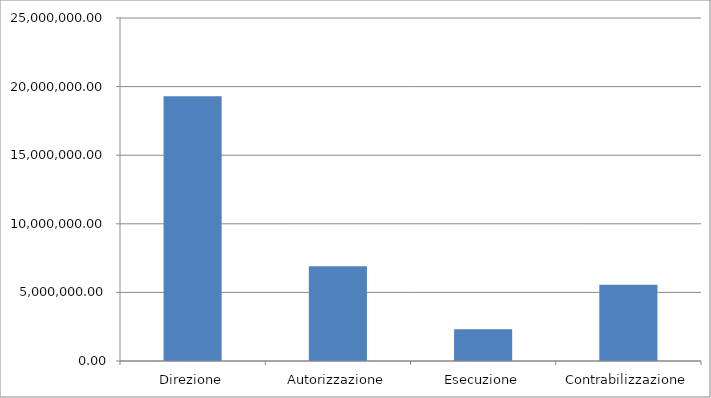
| Category | Series 0 |
|---|---|
| Direzione | 19288810.164 |
| Autorizzazione | 6910216.762 |
| Esecuzione | 2311299.907 |
| Contrabilizzazione | 5564382.878 |